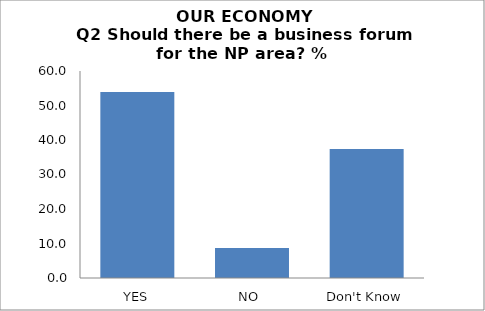
| Category | Series 0 |
|---|---|
| YES | 53.933 |
| NO  | 8.708 |
| Don't Know | 37.36 |